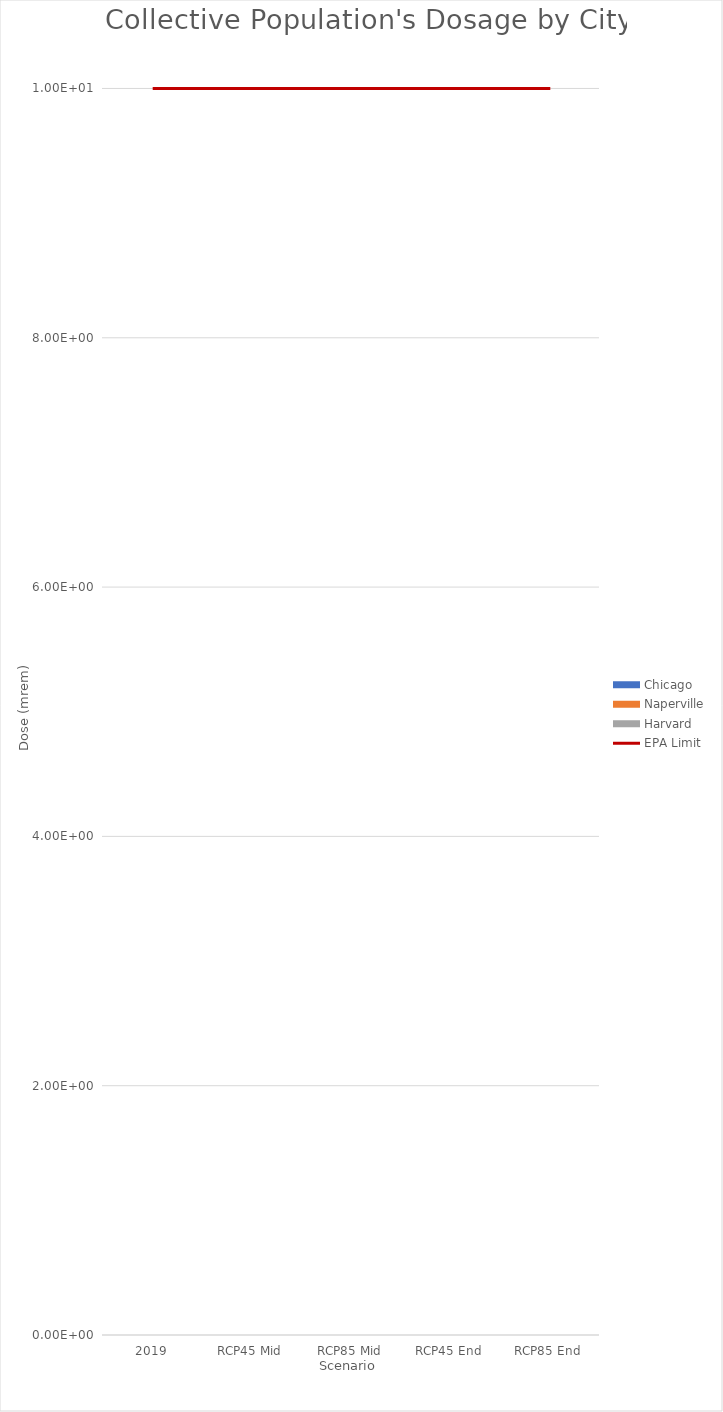
| Category | Chicago | Naperville | Harvard |
|---|---|---|---|
| 2019 | 0 | 0 | 0 |
| RCP45 Mid | 0 | 0 | 0 |
| RCP85 Mid | 0 | 0 | 0 |
| RCP45 End | 0 | 0 | 0 |
| RCP85 End | 0 | 0 | 0 |